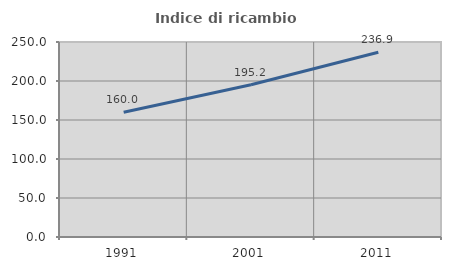
| Category | Indice di ricambio occupazionale  |
|---|---|
| 1991.0 | 160.048 |
| 2001.0 | 195.153 |
| 2011.0 | 236.932 |